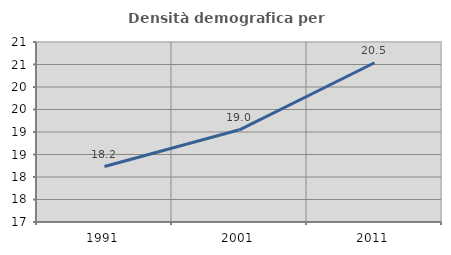
| Category | Densità demografica |
|---|---|
| 1991.0 | 18.232 |
| 2001.0 | 19.049 |
| 2011.0 | 20.538 |